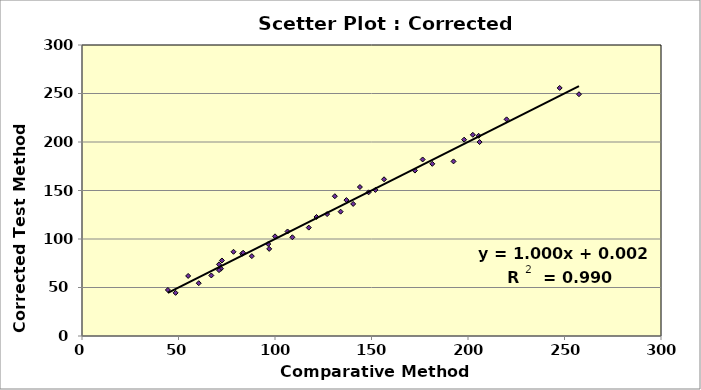
| Category | Corrected Model  |
|---|---|
| 83.0 | 84.832 |
| 156.5 | 161.562 |
| 198.0 | 202.419 |
| 48.5 | 44.474 |
| 72.0 | 69.386 |
| 176.5 | 181.99 |
| 220.0 | 223.345 |
| 137.0 | 140.138 |
| 172.5 | 170.531 |
| 78.5 | 86.825 |
| 148.5 | 148.11 |
| 247.5 | 255.731 |
| 44.5 | 47.464 |
| 97.0 | 89.815 |
| 71.0 | 73.871 |
| 55.0 | 61.913 |
| 152.0 | 150.601 |
| 205.5 | 206.405 |
| 109.0 | 101.773 |
| 121.5 | 122.699 |
| 134.0 | 128.18 |
| 100.0 | 102.769 |
| 202.5 | 207.401 |
| 71.0 | 67.892 |
| 192.5 | 179.997 |
| 96.5 | 94.797 |
| 131.0 | 144.124 |
| 117.5 | 111.738 |
| 88.0 | 82.341 |
| 206.0 | 199.927 |
| 144.0 | 153.59 |
| 72.5 | 77.857 |
| 60.5 | 54.439 |
| 181.5 | 177.506 |
| 257.5 | 249.254 |
| 127.0 | 125.688 |
| 83.5 | 85.829 |
| 67.0 | 62.411 |
| 140.5 | 136.152 |
| 106.5 | 107.752 |